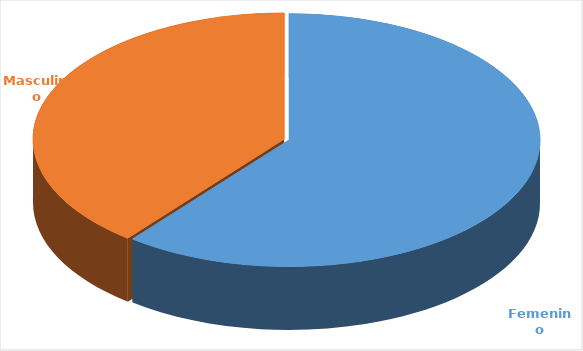
| Category | Cantidad  |
|---|---|
| Femenino | 3554 |
| Masculino | 2302 |